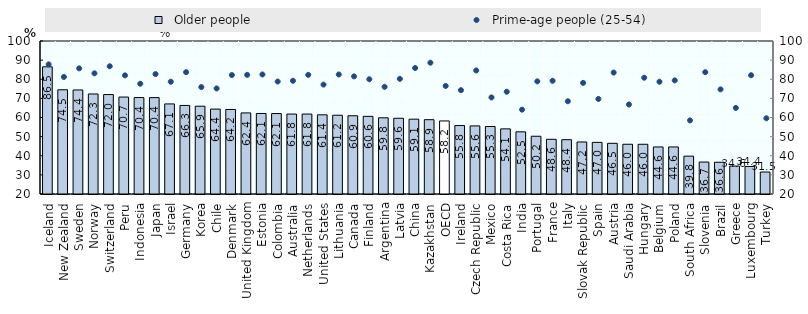
| Category |   Older people |
|---|---|
| Iceland | 86.5 |
| New Zealand | 74.5 |
| Sweden | 74.4 |
| Norway | 72.3 |
| Switzerland | 72 |
| Peru | 70.694 |
| Indonesia | 70.424 |
| Japan | 70.4 |
| Israel | 67.1 |
| Germany | 66.3 |
| Korea | 65.9 |
| Chile | 64.4 |
| Denmark | 64.2 |
| United Kingdom | 62.4 |
| Estonia | 62.1 |
| Colombia | 62.066 |
| Australia | 61.8 |
| Netherlands | 61.8 |
| United States | 61.4 |
| Lithuania | 61.2 |
| Canada | 60.9 |
| Finland | 60.6 |
| Argentina | 59.843 |
| Latvia | 59.6 |
| China | 59.131 |
| Kazakhstan | 58.861 |
| OECD | 58.2 |
| Ireland | 55.8 |
| Czech Republic | 55.6 |
| Mexico | 55.3 |
| Costa Rica | 54.055 |
| India | 52.506 |
| Portugal | 50.2 |
| France | 48.6 |
| Italy | 48.4 |
| Slovak Republic | 47.2 |
| Spain | 47 |
| Austria | 46.5 |
| Saudi Arabia | 46.013 |
| Hungary | 46 |
| Belgium | 44.6 |
| Poland | 44.6 |
| South Africa | 39.791 |
| Slovenia | 36.7 |
| Brazil | 36.594 |
| Greece | 34.6 |
| Luxembourg | 34.4 |
| Turkey | 31.5 |